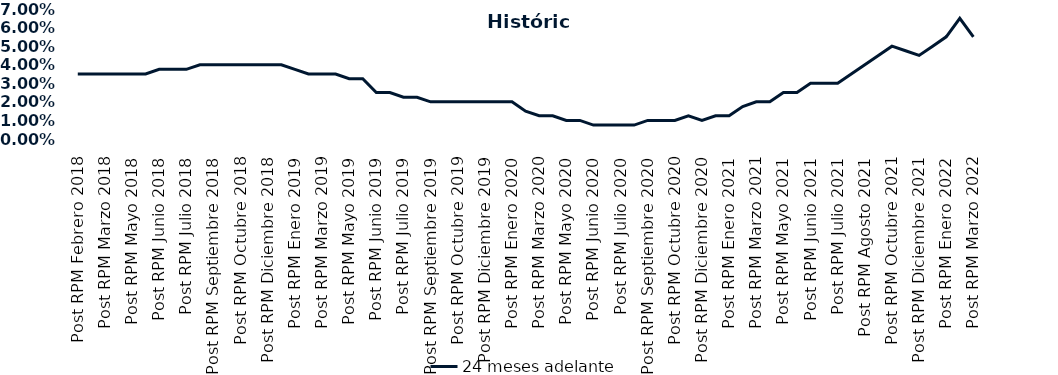
| Category | 24 meses adelante  |
|---|---|
| Post RPM Febrero 2018 | 0.035 |
| Pre RPM Marzo 2018 | 0.035 |
| Post RPM Marzo 2018 | 0.035 |
| Pre RPM Mayo 2018 | 0.035 |
| Post RPM Mayo 2018 | 0.035 |
| Pre RPM Junio 2018 | 0.035 |
| Post RPM Junio 2018 | 0.038 |
| Pre RPM Julio 2018 | 0.038 |
| Post RPM Julio 2018 | 0.038 |
| Pre RPM Septiembre 2018 | 0.04 |
| Post RPM Septiembre 2018 | 0.04 |
| Pre RPM Octubre 2018 | 0.04 |
| Post RPM Octubre 2018 | 0.04 |
| Pre RPM Diciembre 2018 | 0.04 |
| Post RPM Diciembre 2018 | 0.04 |
| Pre RPM Enero 2019 | 0.04 |
| Post RPM Enero 2019 | 0.038 |
| Pre RPM Marzo 2019 | 0.035 |
| Post RPM Marzo 2019 | 0.035 |
| Pre RPM Mayo 2019 | 0.035 |
| Post RPM Mayo 2019 | 0.032 |
| Pre RPM Junio 2019 | 0.032 |
| Post RPM Junio 2019 | 0.025 |
| Pre RPM Julio 2019 | 0.025 |
| Post RPM Julio 2019 | 0.022 |
| Pre RPM Septiembre 2019 | 0.022 |
| Post RPM Septiembre 2019 | 0.02 |
| Pre RPM Octubre 2019 | 0.02 |
| Post RPM Octubre 2019 | 0.02 |
| Pre RPM Diciembre 2019 | 0.02 |
| Post RPM Diciembre 2019 | 0.02 |
| Pre RPM Enero 2020 | 0.02 |
| Post RPM Enero 2020 | 0.02 |
| Pre RPM Marzo 2020 | 0.015 |
| Post RPM Marzo 2020 | 0.012 |
| Pre RPM Mayo 2020 | 0.012 |
| Post RPM Mayo 2020 | 0.01 |
| Pre RPM Junio 2020 | 0.01 |
| Post RPM Junio 2020 | 0.008 |
| Pre RPM Julio 2020 | 0.008 |
| Post RPM Julio 2020 | 0.008 |
| Pre RPM Septiembre 2020 | 0.008 |
| Post RPM Septiembre 2020 | 0.01 |
| Pre RPM Octubre 2020 | 0.01 |
| Post RPM Octubre 2020 | 0.01 |
| Pre RPM Diciembre 2020 | 0.012 |
| Post RPM Diciembre 2020 | 0.01 |
| Pre RPM Enero 2021 | 0.012 |
| Post RPM Enero 2021 | 0.012 |
| Pre RPM Marzo 2021 | 0.018 |
| Post RPM Marzo 2021 | 0.02 |
| Pre RPM Mayo 2021 | 0.02 |
| Post RPM Mayo 2021 | 0.025 |
| Pre RPM Junio 2021 | 0.025 |
| Post RPM Junio 2021 | 0.03 |
| Pre RPM Julio 2021 | 0.03 |
| Post RPM Julio 2021 | 0.03 |
| Pre RPM Agosto 2021 | 0.035 |
| Post RPM Agosto 2021 | 0.04 |
| Pre RPM Octubre 2021 | 0.045 |
| Post RPM Octubre 2021 | 0.05 |
| Pre RPM Diciembre 2021 | 0.048 |
| Post RPM Diciembre 2021 | 0.045 |
| Pre RPM Enero 2022 | 0.05 |
| Post RPM Enero 2022 | 0.055 |
| Pre RPM Marzo 2022 | 0.065 |
| Post RPM Marzo 2022 | 0.055 |